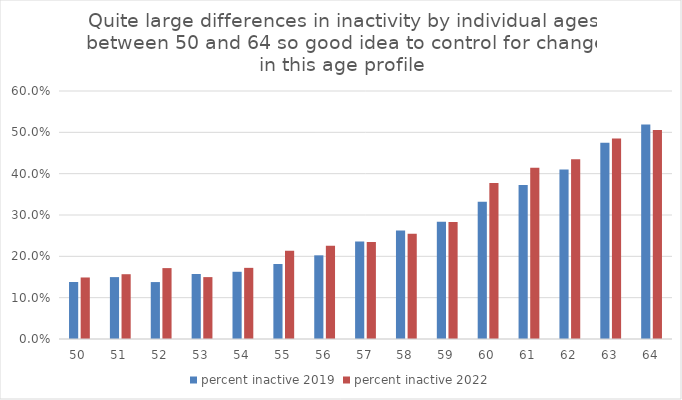
| Category | percent inactive 2019 | percent inactive 2022 |
|---|---|---|
| 50 | 0.138 | 0.149 |
| 51 | 0.15 | 0.157 |
| 52 | 0.138 | 0.172 |
| 53 | 0.157 | 0.15 |
| 54 | 0.163 | 0.172 |
| 55 | 0.181 | 0.214 |
| 56 | 0.202 | 0.226 |
| 57 | 0.236 | 0.235 |
| 58 | 0.262 | 0.255 |
| 59 | 0.283 | 0.283 |
| 60 | 0.332 | 0.377 |
| 61 | 0.372 | 0.414 |
| 62 | 0.41 | 0.435 |
| 63 | 0.475 | 0.485 |
| 64 | 0.519 | 0.506 |